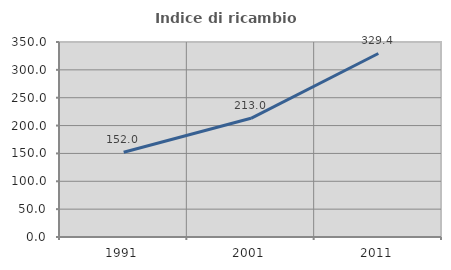
| Category | Indice di ricambio occupazionale  |
|---|---|
| 1991.0 | 152 |
| 2001.0 | 213.043 |
| 2011.0 | 329.412 |